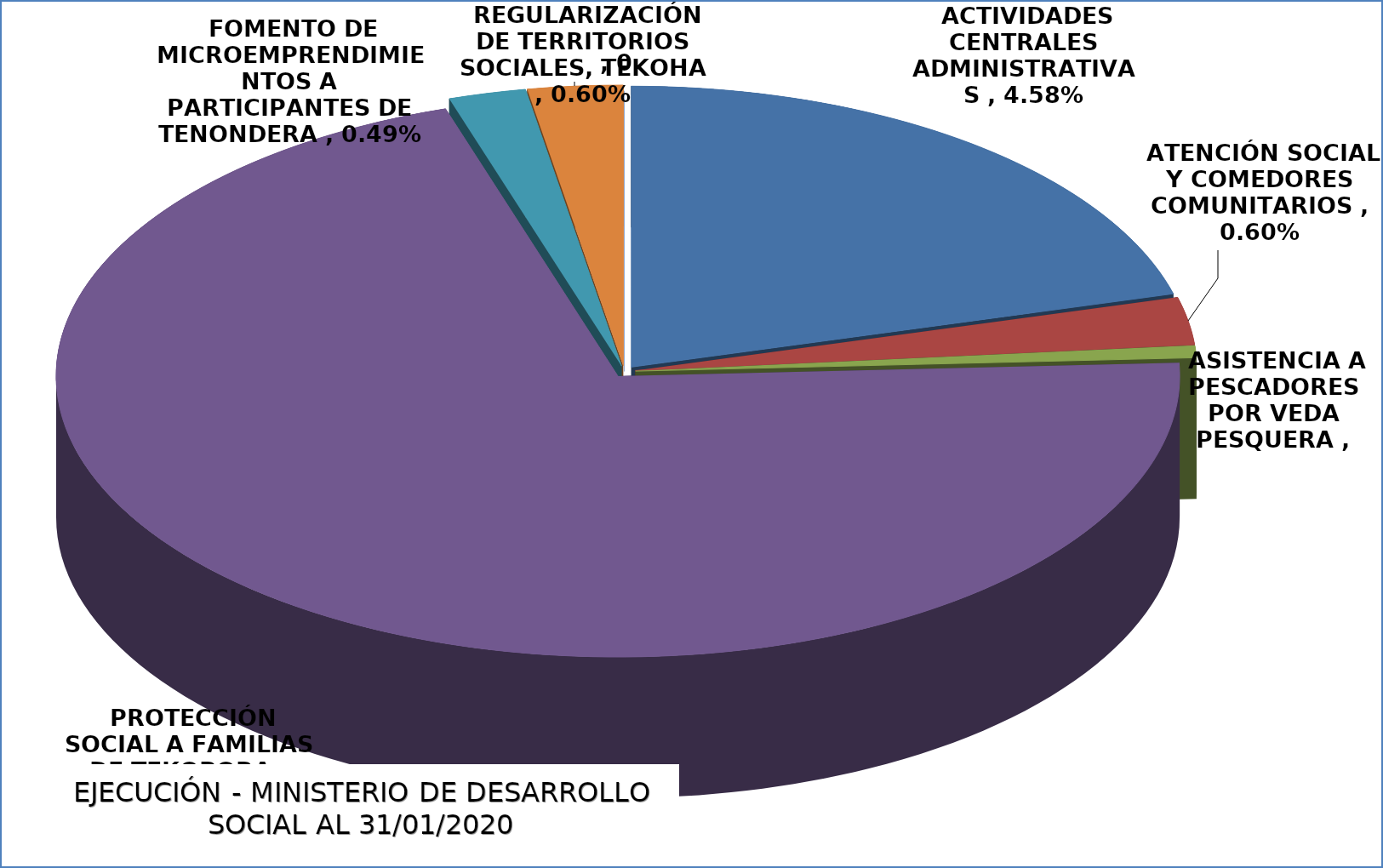
| Category |  EJECUCIÓN - MINISTERIO DE DESARROLLO SOCIAL  |
|---|---|
|  ACTIVIDADES CENTRALES ADMINISTRATIVAS  | 0.046 |
|  ATENCIÓN SOCIAL Y COMEDORES COMUNITARIOS  | 0.006 |
|  ASISTENCIA A PESCADORES POR VEDA PESQUERA  | 0.002 |
|  PROTECCIÓN SOCIAL A FAMILIAS DE TEKOPORA  | 0.156 |
|  FOMENTO DE MICROEMPRENDIMIENTOS A PARTICIPANTES DE TENONDERA  | 0.005 |
|  REGULARIZACIÓN DE TERRITORIOS SOCIALES, TEKOHA  | 0.006 |